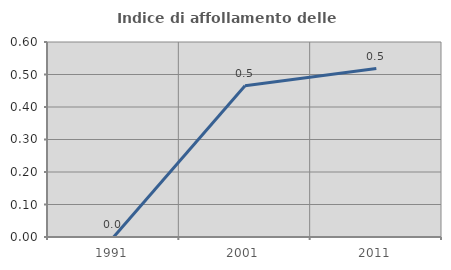
| Category | Indice di affollamento delle abitazioni  |
|---|---|
| 1991.0 | 0 |
| 2001.0 | 0.465 |
| 2011.0 | 0.518 |